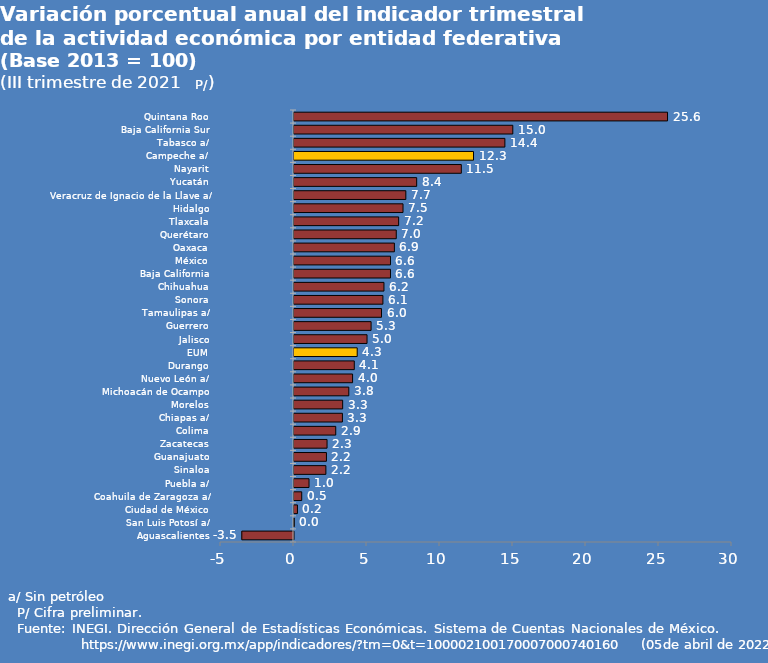
| Category | Series 0 |
|---|---|
| Aguascalientes | -3.541 |
| San Luis Potosí a/ | 0.019 |
| Ciudad de México | 0.236 |
| Coahuila de Zaragoza a/ | 0.53 |
| Puebla a/ | 1.029 |
| Sinaloa | 2.183 |
| Guanajuato | 2.222 |
| Zacatecas | 2.264 |
| Colima | 2.859 |
| Chiapas a/ | 3.317 |
| Morelos | 3.333 |
| Michoacán de Ocampo | 3.753 |
| Nuevo León a/ | 4.013 |
| Durango | 4.13 |
| EUM | 4.329 |
| Jalisco | 5.003 |
| Guerrero | 5.28 |
| Tamaulipas a/ | 5.994 |
| Sonora | 6.09 |
| Chihuahua | 6.162 |
| Baja California | 6.608 |
| México | 6.609 |
| Oaxaca | 6.875 |
| Querétaro | 7.004 |
| Tlaxcala | 7.168 |
| Hidalgo | 7.467 |
| Veracruz de Ignacio de la Llave a/ | 7.66 |
| Yucatán | 8.403 |
| Nayarit | 11.46 |
| Campeche a/ | 12.296 |
| Tabasco a/ | 14.444 |
| Baja California Sur | 14.986 |
| Quintana Roo | 25.584 |